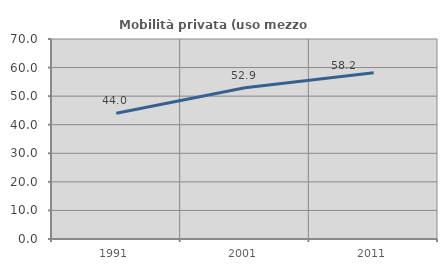
| Category | Mobilità privata (uso mezzo privato) |
|---|---|
| 1991.0 | 44.012 |
| 2001.0 | 52.931 |
| 2011.0 | 58.182 |